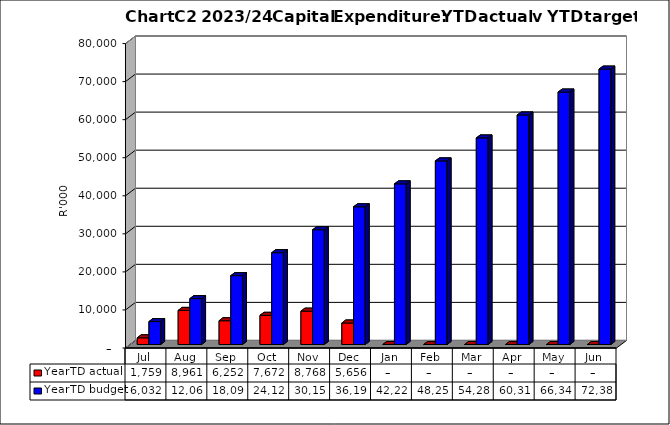
| Category | YearTD actual | YearTD budget |
|---|---|---|
| Jul | 1759374.9 | 6031706 |
| Aug | 8961182.31 | 12063412 |
| Sep | 6251636.02 | 18095118 |
| Oct | 7671938.68 | 24126824 |
| Nov | 8768380.14 | 30158530 |
| Dec | 5656425.03 | 36190236 |
| Jan | 0 | 42221942 |
| Feb | 0 | 48253648 |
| Mar | 0 | 54285354 |
| Apr | 0 | 60317060 |
| May | 0 | 66348766 |
| Jun | 0 | 72380350 |